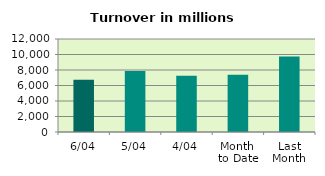
| Category | Series 0 |
|---|---|
| 6/04 | 6742.797 |
| 5/04 | 7880.303 |
| 4/04 | 7249.751 |
| Month 
to Date | 7384.501 |
| Last
Month | 9734.736 |